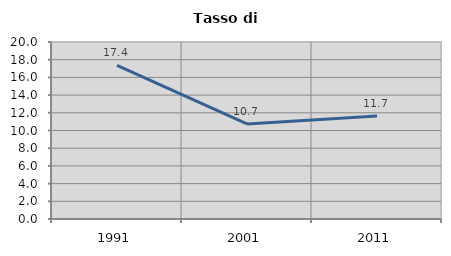
| Category | Tasso di disoccupazione   |
|---|---|
| 1991.0 | 17.363 |
| 2001.0 | 10.747 |
| 2011.0 | 11.651 |